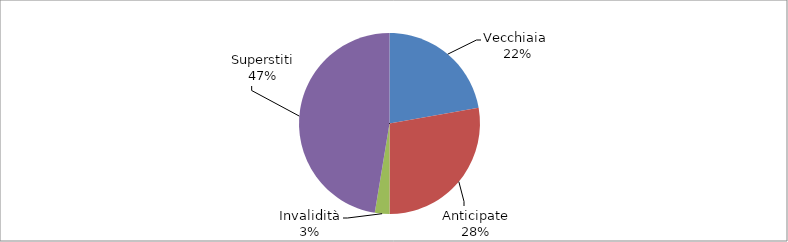
| Category | Series 0 |
|---|---|
| Vecchiaia  | 6002 |
| Anticipate | 7490 |
| Invalidità | 708 |
| Superstiti | 12792 |